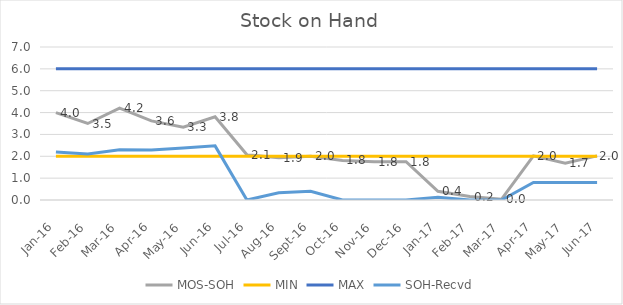
| Category | MOS-SOH | MIN | MAX | SOH-Recvd |
|---|---|---|---|---|
| 2016-01-01 | 4 | 2 | 6 | 2.2 |
| 2016-02-01 | 3.5 | 2 | 6 | 2.1 |
| 2016-03-01 | 4.2 | 2 | 6 | 2.3 |
| 2016-04-01 | 3.619 | 2 | 6 | 2.286 |
| 2016-05-01 | 3.333 | 2 | 6 | 2.381 |
| 2016-06-01 | 3.81 | 2 | 6 | 2.476 |
| 2016-07-01 | 2.067 | 2 | 6 | 0 |
| 2016-08-01 | 1.933 | 2 | 6 | 0.333 |
| 2016-09-01 | 2 | 2 | 6 | 0.4 |
| 2016-10-01 | 1.812 | 2 | 6 | 0 |
| 2016-11-01 | 1.75 | 2 | 6 | 0 |
| 2016-12-01 | 1.75 | 2 | 6 | 0 |
| 2017-01-01 | 0.4 | 2 | 6 | 0.12 |
| 2017-02-01 | 0.16 | 2 | 6 | 0 |
| 2017-03-01 | 0.04 | 2 | 6 | 0 |
| 2017-04-01 | 2.02 | 2 | 6 | 0.8 |
| 2017-05-01 | 1.68 | 2 | 6 | 0.8 |
| 2017-06-01 | 2.02 | 2 | 6 | 0.8 |